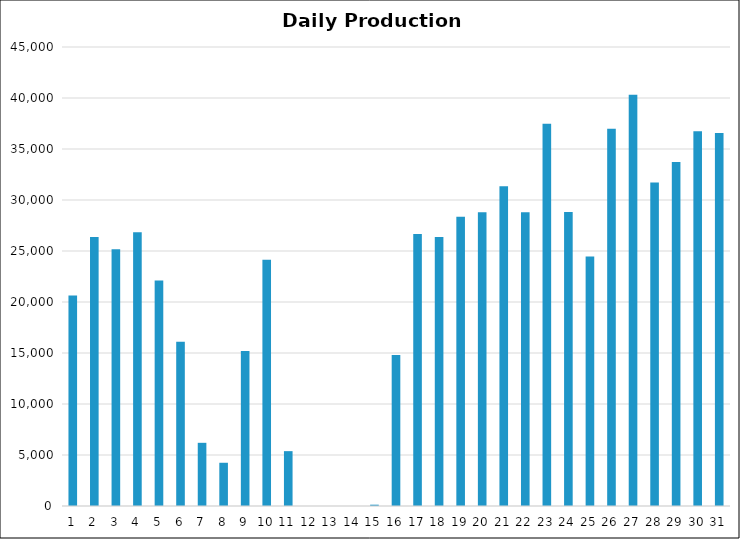
| Category | Series 0 |
|---|---|
| 0 | 20625.25 |
| 1 | 26384.75 |
| 2 | 25163.75 |
| 3 | 26829.75 |
| 4 | 22119.5 |
| 5 | 16108.75 |
| 6 | 6194.5 |
| 7 | 4238.5 |
| 8 | 15204 |
| 9 | 24131.75 |
| 10 | 5377.75 |
| 11 | 0 |
| 12 | 0 |
| 13 | 0 |
| 14 | 128.5 |
| 15 | 14809 |
| 16 | 26657 |
| 17 | 26364.75 |
| 18 | 28368.679 |
| 19 | 28807.693 |
| 20 | 31353.25 |
| 21 | 28804.75 |
| 22 | 37472 |
| 23 | 28826.5 |
| 24 | 24450.25 |
| 25 | 36986.25 |
| 26 | 40325 |
| 27 | 31712.75 |
| 28 | 33716 |
| 29 | 36744.25 |
| 30 | 36574.25 |